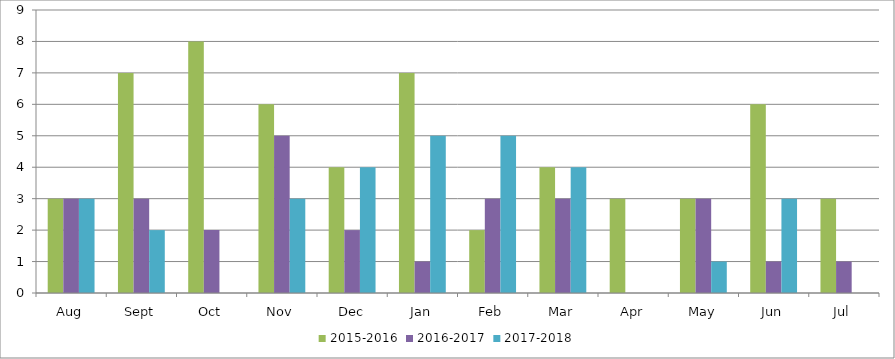
| Category | 2015-2016 | 2016-2017 | 2017-2018 |
|---|---|---|---|
| Aug | 3 | 3 | 3 |
| Sept | 7 | 3 | 2 |
| Oct | 8 | 2 | 0 |
| Nov | 6 | 5 | 3 |
| Dec | 4 | 2 | 4 |
| Jan | 7 | 1 | 5 |
| Feb | 2 | 3 | 5 |
| Mar | 4 | 3 | 4 |
| Apr | 3 | 0 | 0 |
| May | 3 | 3 | 1 |
| Jun | 6 | 1 | 3 |
| Jul | 3 | 1 | 0 |